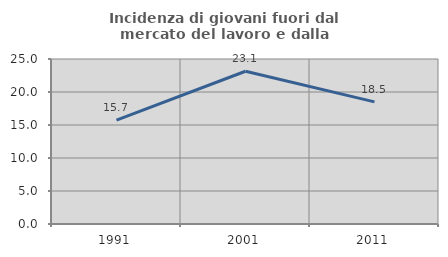
| Category | Incidenza di giovani fuori dal mercato del lavoro e dalla formazione  |
|---|---|
| 1991.0 | 15.738 |
| 2001.0 | 23.148 |
| 2011.0 | 18.501 |